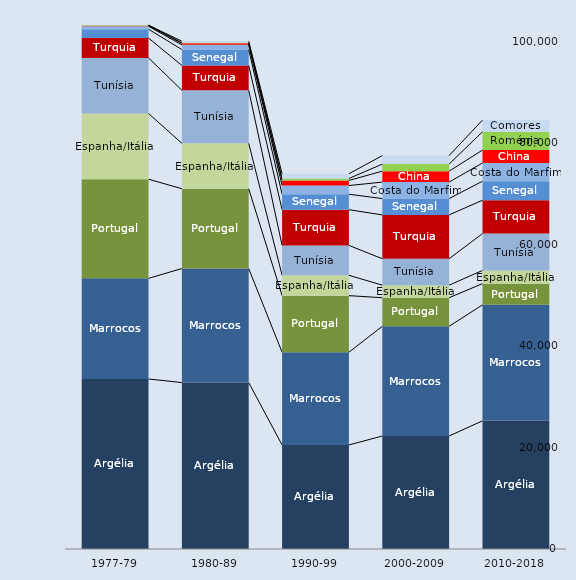
| Category | Argélia | Marrocos | Portugal | Espanha/Itália | Tunísia | Turquia | Senegal | Costa do Marfim | China | Roménia | Comores |
|---|---|---|---|---|---|---|---|---|---|---|---|
| 1977-79 | 33493.667 | 19826 | 19529.667 | 12952.667 | 10947.333 | 3907.667 | 1740.333 | 569.333 | 133.667 | 89 | 0 |
| 1980-89 | 32787.7 | 22459.3 | 15724.1 | 8947.4 | 10453.2 | 4889.2 | 3129.1 | 923.2 | 301.3 | 108.4 | 309.6 |
| 1990-99 | 20493.8 | 18266.9 | 11148.1 | 4013.9 | 5884.1 | 7032.2 | 3048.7 | 1710.4 | 1003.8 | 387.6 | 935.7 |
| 2000-2009 | 22260.7 | 21613.9 | 5628.7 | 2473.4 | 5206.5 | 8631.5 | 3218.7 | 3244.8 | 2155 | 1388.3 | 1675.2 |
| 2010-2018 | 25247.2 | 22848.1 | 4181.4 | 2597.1 | 7257.1 | 6576.4 | 3744.4 | 3589.5 | 2544.8 | 3613.6 | 2289.2 |